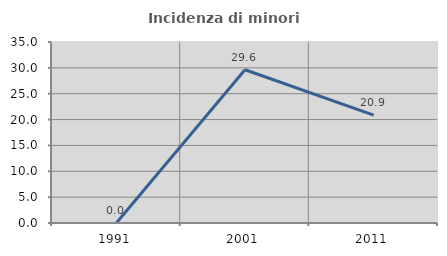
| Category | Incidenza di minori stranieri |
|---|---|
| 1991.0 | 0 |
| 2001.0 | 29.63 |
| 2011.0 | 20.863 |